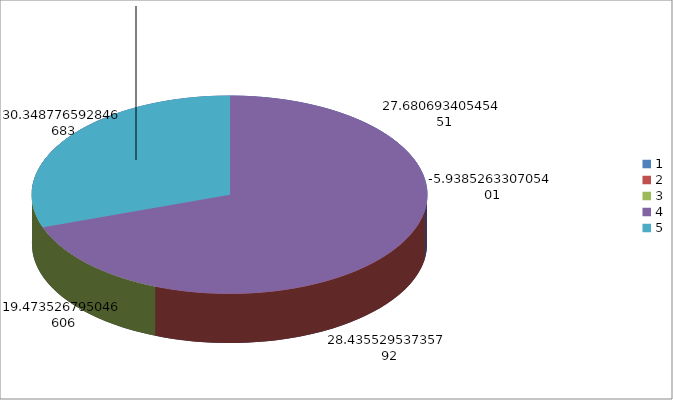
| Category | Series 0 |
|---|---|
| 0 | 27.681 |
| 1 | 28.436 |
| 2 | 19.474 |
| 3 | -5.939 |
| 4 | 30.349 |